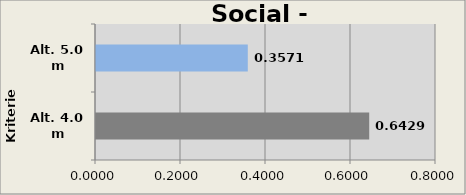
| Category | Aesthetic |
|---|---|
| Alt. 4.0 m | 0.643 |
| Alt. 5.0 m | 0.357 |